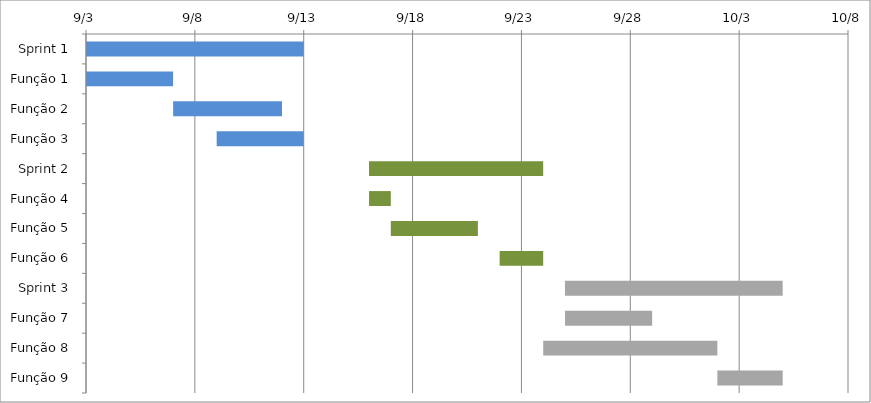
| Category | Início | Dias |
|---|---|---|
| Sprint 1 | 2016-09-03 | 10 |
| Função 1 | 2016-09-03 | 4 |
| Função 2 | 2016-09-07 | 5 |
| Função 3 | 2016-09-09 | 4 |
| Sprint 2 | 2016-09-16 | 8 |
| Função 4 | 2016-09-16 | 1 |
| Função 5 | 2016-09-17 | 4 |
| Função 6 | 2016-09-22 | 2 |
| Sprint 3 | 2016-09-25 | 10 |
| Função 7 | 2016-09-25 | 4 |
| Função 8 | 2016-09-24 | 8 |
| Função 9 | 2016-10-02 | 3 |